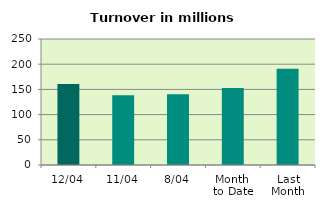
| Category | Series 0 |
|---|---|
| 12/04 | 160.917 |
| 11/04 | 138.247 |
| 8/04 | 140.231 |
| Month 
to Date | 152.772 |
| Last
Month | 190.797 |